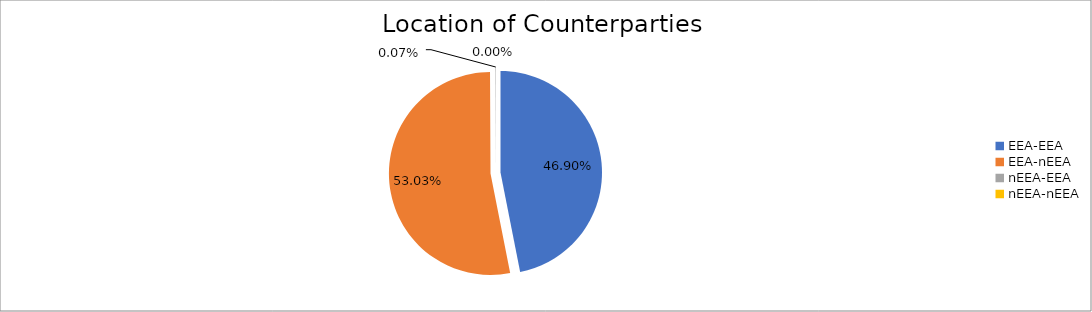
| Category | Series 0 |
|---|---|
| EEA-EEA | 6623760.042 |
| EEA-nEEA | 7489870.374 |
| nEEA-EEA | 10255.123 |
| nEEA-nEEA | 544.301 |